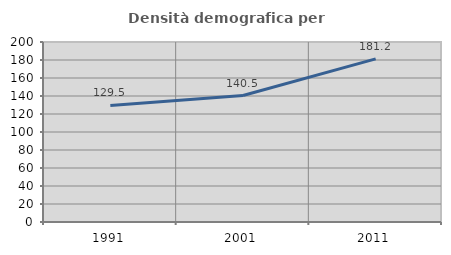
| Category | Densità demografica |
|---|---|
| 1991.0 | 129.504 |
| 2001.0 | 140.52 |
| 2011.0 | 181.23 |